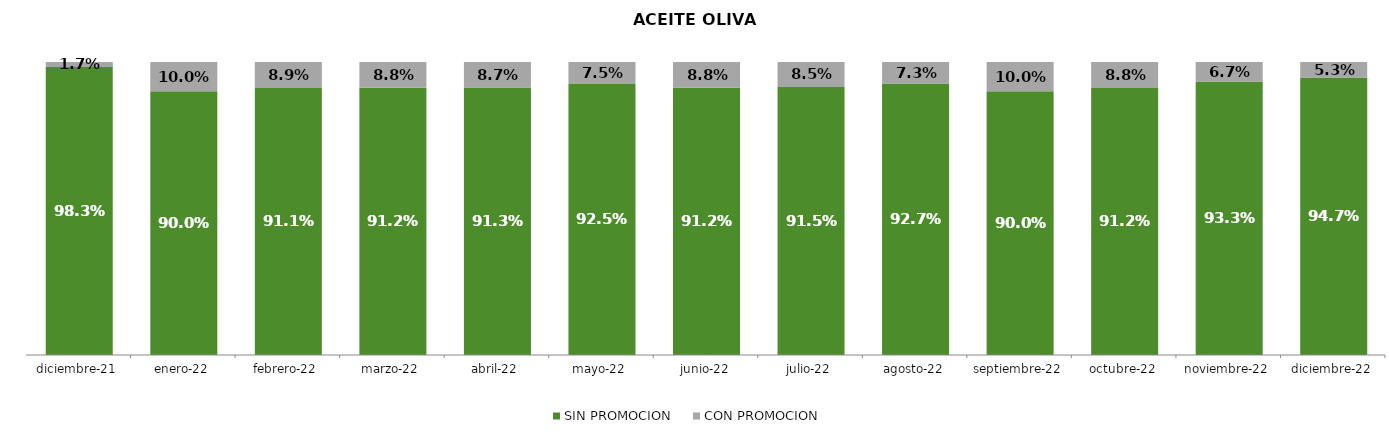
| Category | SIN PROMOCION   | CON PROMOCION   |
|---|---|---|
| 2021-12-01 | 0.983 | 0.017 |
| 2022-01-01 | 0.9 | 0.1 |
| 2022-02-01 | 0.911 | 0.089 |
| 2022-03-01 | 0.912 | 0.088 |
| 2022-04-01 | 0.913 | 0.087 |
| 2022-05-01 | 0.925 | 0.075 |
| 2022-06-01 | 0.912 | 0.088 |
| 2022-07-01 | 0.915 | 0.085 |
| 2022-08-01 | 0.927 | 0.073 |
| 2022-09-01 | 0.9 | 0.1 |
| 2022-10-01 | 0.912 | 0.088 |
| 2022-11-01 | 0.933 | 0.067 |
| 2022-12-01 | 0.947 | 0.053 |